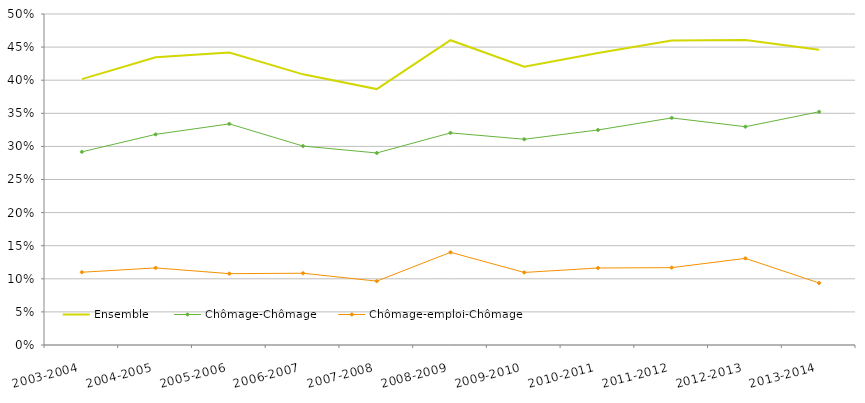
| Category | Ensemble | Chômage-Chômage | Chômage-emploi-Chômage |
|---|---|---|---|
| 2003-2004 | 0.402 | 0.292 | 0.11 |
| 2004-2005 | 0.435 | 0.318 | 0.116 |
| 2005-2006 | 0.442 | 0.334 | 0.108 |
| 2006-2007 | 0.409 | 0.3 | 0.108 |
| 2007-2008 | 0.387 | 0.29 | 0.096 |
| 2008-2009 | 0.46 | 0.32 | 0.14 |
| 2009-2010 | 0.42 | 0.311 | 0.11 |
| 2010-2011 | 0.441 | 0.325 | 0.116 |
| 2011-2012 | 0.46 | 0.343 | 0.117 |
| 2012-2013 | 0.461 | 0.33 | 0.131 |
| 2013-2014 | 0.446 | 0.352 | 0.094 |